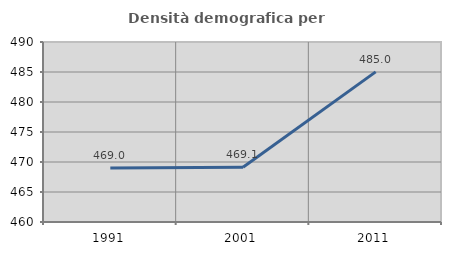
| Category | Densità demografica |
|---|---|
| 1991.0 | 469.013 |
| 2001.0 | 469.115 |
| 2011.0 | 485.024 |